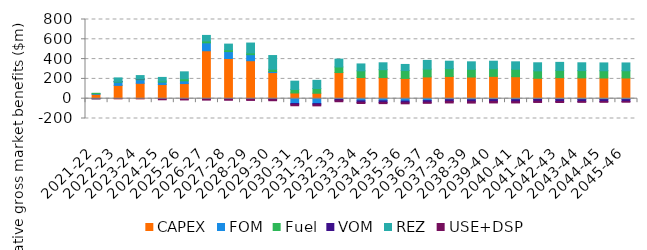
| Category | CAPEX | FOM | Fuel | VOM | REZ | USE+DSP |
|---|---|---|---|---|---|---|
| 2021-22 | 44.484 | 6.986 | 3.133 | -0.05 | 0 | -0.192 |
| 2022-23 | 134.515 | 32.774 | 6.588 | 0.24 | 35.898 | -0.193 |
| 2023-24 | 155.627 | 35.521 | 7.946 | 0.343 | 34.139 | -0.5 |
| 2024-25 | 143.048 | 25.018 | 11.017 | -0.068 | 35.92 | -10.903 |
| 2025-26 | 152.856 | 27.528 | 20.352 | -1.653 | 70.611 | -10.904 |
| 2026-27 | 484.328 | 80.068 | 19.03 | -3.339 | 55.767 | -10.904 |
| 2027-28 | 406.268 | 69.82 | 18.729 | -4.873 | 56.623 | -10.905 |
| 2028-29 | 383.687 | 61.232 | 17.677 | -6.489 | 99.558 | -10.905 |
| 2029-30 | 263.719 | 10.721 | 22.833 | -9.49 | 138.657 | -10.906 |
| 2030-31 | 57.983 | -48.552 | 35.681 | -11.797 | 83.45 | -10.906 |
| 2031-32 | 55.202 | -49.233 | 47.279 | -12.301 | 82.852 | -10.907 |
| 2032-33 | 264.096 | -5.823 | 56.418 | -13.85 | 79.159 | -10.901 |
| 2033-34 | 213.698 | -21.411 | 67.837 | -15.91 | 69.639 | -10.901 |
| 2034-35 | 213.698 | -21.411 | 79.335 | -17.374 | 69.639 | -10.902 |
| 2035-36 | 204.838 | -24.046 | 79.664 | -16.82 | 61.49 | -10.748 |
| 2036-37 | 220.234 | -19.48 | 78.803 | -16.664 | 87.796 | -10.616 |
| 2037-38 | 225.016 | -10.128 | 78.004 | -17.546 | 75.772 | -15.292 |
| 2038-39 | 218.977 | -11.49 | 78.002 | -18.012 | 75.485 | -14.867 |
| 2039-40 | 225.599 | -9.445 | 77.123 | -18.926 | 75.988 | -14.269 |
| 2040-41 | 221.922 | -10.52 | 75.542 | -19.557 | 75.046 | -12.658 |
| 2041-42 | 206.344 | -6.659 | 74.98 | -19.17 | 81.422 | -12.161 |
| 2042-43 | 212.307 | -8.948 | 73.954 | -19.087 | 80.662 | -10.298 |
| 2043-44 | 210.322 | -9.554 | 73.535 | -19.114 | 78.844 | -8.347 |
| 2044-45 | 209.361 | -9.589 | 73.218 | -19.133 | 78.844 | -7.773 |
| 2045-46 | 209.361 | -9.589 | 72.91 | -19.159 | 78.844 | -6.641 |